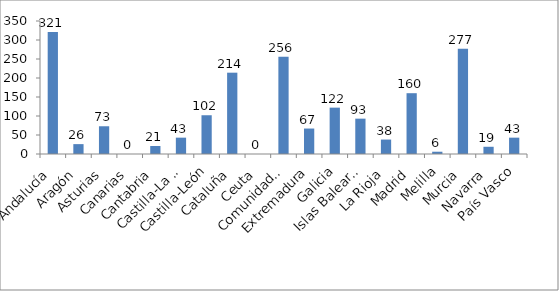
| Category | Series 0 |
|---|---|
| Andalucía | 321 |
| Aragón | 26 |
| Asturias | 73 |
| Canarias | 0 |
| Cantabria | 21 |
| Castilla-La Mancha | 43 |
| Castilla-León | 102 |
| Cataluña | 214 |
| Ceuta | 0 |
| Comunidad Valenciana | 256 |
| Extremadura | 67 |
| Galicia | 122 |
| Islas Baleares | 93 |
| La Rioja | 38 |
| Madrid | 160 |
| Melilla | 6 |
| Murcia | 277 |
| Navarra | 19 |
| País Vasco | 43 |